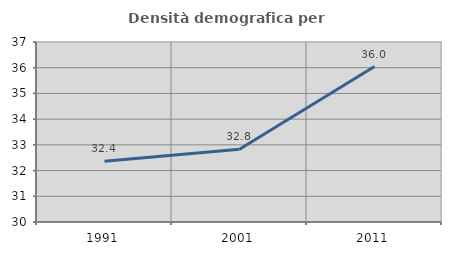
| Category | Densità demografica |
|---|---|
| 1991.0 | 32.361 |
| 2001.0 | 32.829 |
| 2011.0 | 36.046 |